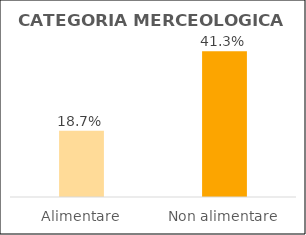
| Category | Series 0 |
|---|---|
| Alimentare | 0.187 |
| Non alimentare | 0.413 |